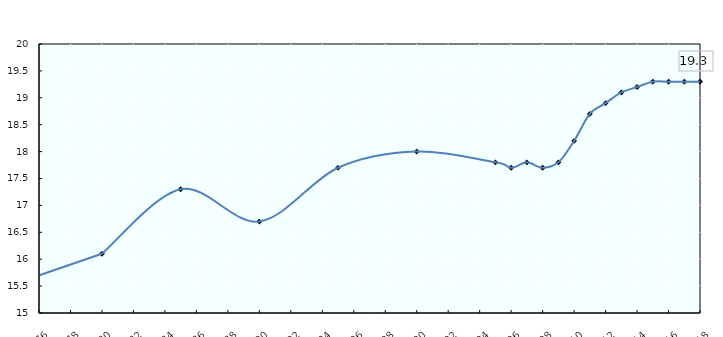
| Category | Unweighted average |
|---|---|
| 1975.0 | 15.6 |
| 1980.0 | 16.1 |
| 1985.0 | 17.3 |
| 1990.0 | 16.7 |
| 1995.0 | 17.7 |
| 2000.0 | 18 |
| 2005.0 | 17.8 |
| 2006.0 | 17.7 |
| 2007.0 | 17.8 |
| 2008.0 | 17.7 |
| 2009.0 | 17.8 |
| 2010.0 | 18.2 |
| 2011.0 | 18.7 |
| 2012.0 | 18.9 |
| 2013.0 | 19.1 |
| 2014.0 | 19.2 |
| 2015.0 | 19.3 |
| 2016.0 | 19.3 |
| 2017.0 | 19.3 |
| 2018.0 | 19.3 |